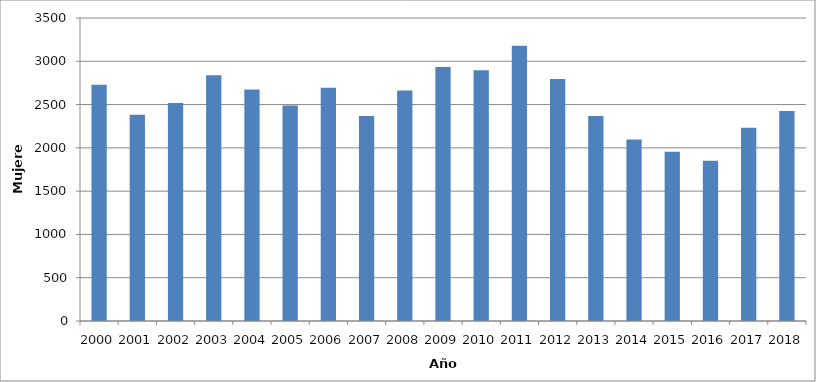
| Category | Series 0 |
|---|---|
| 2000.0 | 2730 |
| 2001.0 | 2381 |
| 2002.0 | 2517 |
| 2003.0 | 2840 |
| 2004.0 | 2674 |
| 2005.0 | 2489 |
| 2006.0 | 2693 |
| 2007.0 | 2368 |
| 2008.0 | 2663 |
| 2009.0 | 2934 |
| 2010.0 | 2897 |
| 2011.0 | 3180 |
| 2012.0 | 2794 |
| 2013.0 | 2367 |
| 2014.0 | 2097 |
| 2015.0 | 1955 |
| 2016.0 | 1850 |
| 2017.0 | 2231 |
| 2018.0 | 2427 |